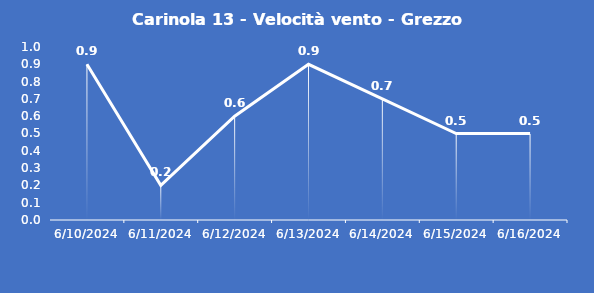
| Category | Carinola 13 - Velocità vento - Grezzo (m/s) |
|---|---|
| 6/10/24 | 0.9 |
| 6/11/24 | 0.2 |
| 6/12/24 | 0.6 |
| 6/13/24 | 0.9 |
| 6/14/24 | 0.7 |
| 6/15/24 | 0.5 |
| 6/16/24 | 0.5 |